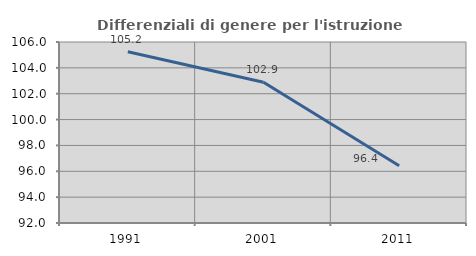
| Category | Differenziali di genere per l'istruzione superiore |
|---|---|
| 1991.0 | 105.249 |
| 2001.0 | 102.882 |
| 2011.0 | 96.427 |